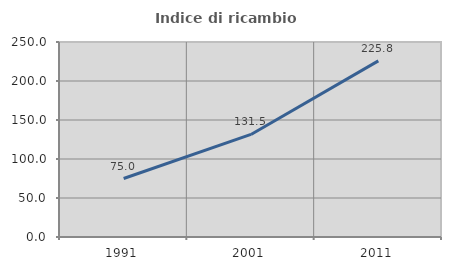
| Category | Indice di ricambio occupazionale  |
|---|---|
| 1991.0 | 75 |
| 2001.0 | 131.507 |
| 2011.0 | 225.758 |